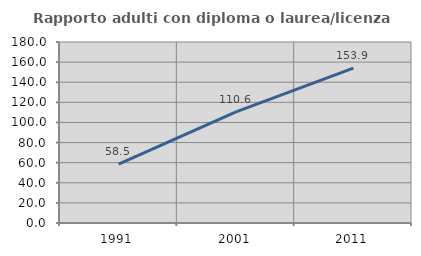
| Category | Rapporto adulti con diploma o laurea/licenza media  |
|---|---|
| 1991.0 | 58.498 |
| 2001.0 | 110.56 |
| 2011.0 | 153.941 |